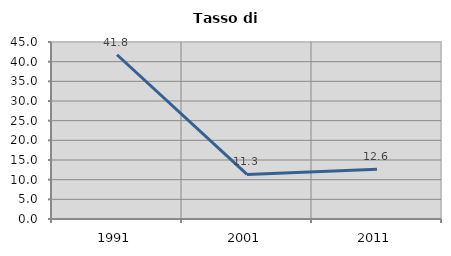
| Category | Tasso di disoccupazione   |
|---|---|
| 1991.0 | 41.756 |
| 2001.0 | 11.321 |
| 2011.0 | 12.629 |